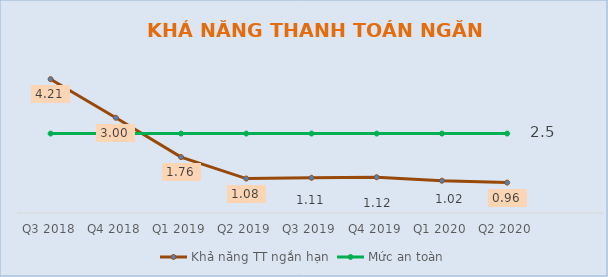
| Category | Khả năng TT ngắn hạn | Mức an toàn |
|---|---|---|
| Q3 2018 | 4.211 | 2.5 |
| Q4 2018 | 2.996 | 2.5 |
| Q1 2019 | 1.759 | 2.5 |
| Q2 2019 | 1.084 | 2.5 |
| Q3 2019 | 1.108 | 2.5 |
| Q4 2019 | 1.125 | 2.5 |
| Q1 2020 | 1.016 | 2.5 |
| Q2 2020 | 0.956 | 2.5 |